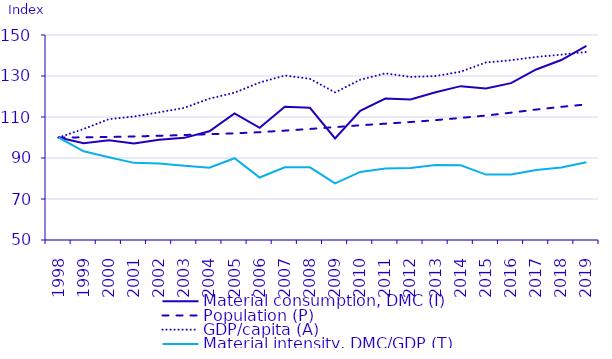
| Category | Material consumption, DMC (I) | Population (P) | GDP/capita (A) | Material intensity, DMC/GDP (T) |
|---|---|---|---|---|
| 1998.0 | 100 | 100 | 100 | 100 |
| 1999.0 | 97.241 | 100.079 | 104.165 | 93.279 |
| 2000.0 | 98.687 | 100.237 | 108.957 | 90.36 |
| 2001.0 | 97.091 | 100.508 | 110.239 | 87.628 |
| 2002.0 | 98.892 | 100.836 | 112.294 | 87.335 |
| 2003.0 | 99.823 | 101.22 | 114.452 | 86.167 |
| 2004.0 | 103.025 | 101.616 | 118.951 | 85.234 |
| 2005.0 | 111.765 | 102.022 | 121.864 | 89.895 |
| 2006.0 | 104.734 | 102.599 | 126.83 | 80.487 |
| 2007.0 | 114.994 | 103.356 | 130.231 | 85.433 |
| 2008.0 | 114.471 | 104.169 | 128.632 | 85.43 |
| 2009.0 | 99.544 | 105.062 | 122.004 | 77.66 |
| 2010.0 | 112.991 | 105.954 | 128.177 | 83.199 |
| 2011.0 | 119.002 | 106.756 | 131.279 | 84.911 |
| 2012.0 | 118.591 | 107.547 | 129.547 | 85.119 |
| 2013.0 | 122.089 | 108.462 | 129.979 | 86.601 |
| 2014.0 | 125.049 | 109.547 | 132.113 | 86.404 |
| 2015.0 | 123.857 | 110.711 | 136.593 | 81.904 |
| 2016.0 | 126.506 | 112.112 | 137.679 | 81.958 |
| 2017.0 | 133.201 | 113.637 | 139.319 | 84.135 |
| 2018.0 | 137.784 | 114.959 | 140.402 | 85.366 |
| 2019.0 | 144.686 | 116.134 | 141.742 | 87.896 |